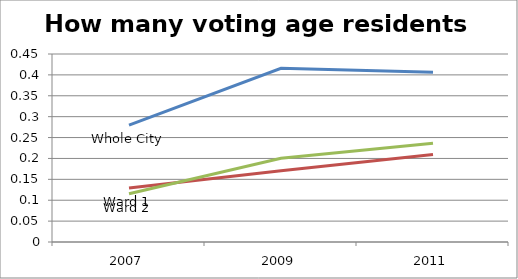
| Category | Whole City | Ward 1 | Ward 2 |
|---|---|---|---|
| 2007.0 | 0.28 | 0.129 | 0.115 |
| 2009.0 | 0.416 | 0.17 | 0.2 |
| 2011.0 | 0.406 | 0.209 | 0.236 |